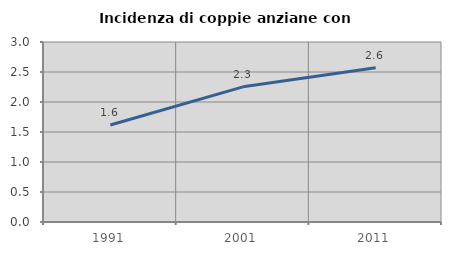
| Category | Incidenza di coppie anziane con figli |
|---|---|
| 1991.0 | 1.617 |
| 2001.0 | 2.253 |
| 2011.0 | 2.57 |